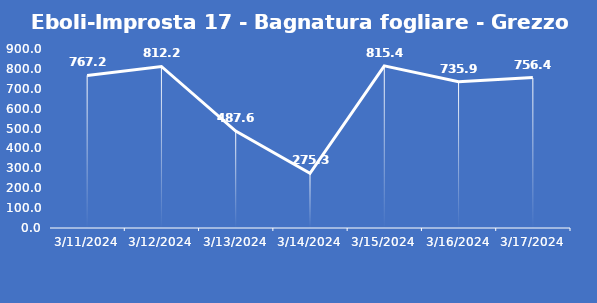
| Category | Eboli-Improsta 17 - Bagnatura fogliare - Grezzo (min) |
|---|---|
| 3/11/24 | 767.2 |
| 3/12/24 | 812.2 |
| 3/13/24 | 487.6 |
| 3/14/24 | 275.3 |
| 3/15/24 | 815.4 |
| 3/16/24 | 735.9 |
| 3/17/24 | 756.4 |